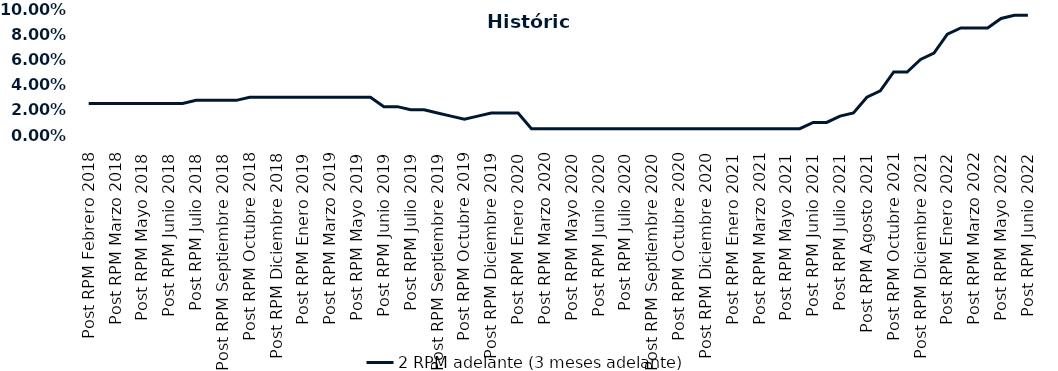
| Category | 2 RPM adelante (3 meses adelante) |
|---|---|
| Post RPM Febrero 2018 | 0.025 |
| Pre RPM Marzo 2018 | 0.025 |
| Post RPM Marzo 2018 | 0.025 |
| Pre RPM Mayo 2018 | 0.025 |
| Post RPM Mayo 2018 | 0.025 |
| Pre RPM Junio 2018 | 0.025 |
| Post RPM Junio 2018 | 0.025 |
| Pre RPM Julio 2018 | 0.025 |
| Post RPM Julio 2018 | 0.028 |
| Pre RPM Septiembre 2018 | 0.028 |
| Post RPM Septiembre 2018 | 0.028 |
| Pre RPM Octubre 2018 | 0.028 |
| Post RPM Octubre 2018 | 0.03 |
| Pre RPM Diciembre 2018 | 0.03 |
| Post RPM Diciembre 2018 | 0.03 |
| Pre RPM Enero 2019 | 0.03 |
| Post RPM Enero 2019 | 0.03 |
| Pre RPM Marzo 2019 | 0.03 |
| Post RPM Marzo 2019 | 0.03 |
| Pre RPM Mayo 2019 | 0.03 |
| Post RPM Mayo 2019 | 0.03 |
| Pre RPM Junio 2019 | 0.03 |
| Post RPM Junio 2019 | 0.022 |
| Pre RPM Julio 2019 | 0.022 |
| Post RPM Julio 2019 | 0.02 |
| Pre RPM Septiembre 2019 | 0.02 |
| Post RPM Septiembre 2019 | 0.018 |
| Pre RPM Octubre 2019 | 0.015 |
| Post RPM Octubre 2019 | 0.012 |
| Pre RPM Diciembre 2019 | 0.015 |
| Post RPM Diciembre 2019 | 0.018 |
| Pre RPM Enero 2020 | 0.018 |
| Post RPM Enero 2020 | 0.018 |
| Pre RPM Marzo 2020 | 0.005 |
| Post RPM Marzo 2020 | 0.005 |
| Pre RPM Mayo 2020 | 0.005 |
| Post RPM Mayo 2020 | 0.005 |
| Pre RPM Junio 2020 | 0.005 |
| Post RPM Junio 2020 | 0.005 |
| Pre RPM Julio 2020 | 0.005 |
| Post RPM Julio 2020 | 0.005 |
| Pre RPM Septiembre 2020 | 0.005 |
| Post RPM Septiembre 2020 | 0.005 |
| Pre RPM Octubre 2020 | 0.005 |
| Post RPM Octubre 2020 | 0.005 |
| Pre RPM Diciembre 2020 | 0.005 |
| Post RPM Diciembre 2020 | 0.005 |
| Pre RPM Enero 2021 | 0.005 |
| Post RPM Enero 2021 | 0.005 |
| Pre RPM Marzo 2021 | 0.005 |
| Post RPM Marzo 2021 | 0.005 |
| Pre RPM Mayo 2021 | 0.005 |
| Post RPM Mayo 2021 | 0.005 |
| Pre RPM Junio 2021 | 0.005 |
| Post RPM Junio 2021 | 0.01 |
| Pre RPM Julio 2021 | 0.01 |
| Post RPM Julio 2021 | 0.015 |
| Pre RPM Agosto 2021 | 0.018 |
| Post RPM Agosto 2021 | 0.03 |
| Pre RPM Octubre 2021 | 0.035 |
| Post RPM Octubre 2021 | 0.05 |
| Pre RPM Diciembre 2021 | 0.05 |
| Post RPM Diciembre 2021 | 0.06 |
| Pre RPM Enero 2022 | 0.065 |
| Post RPM Enero 2022 | 0.08 |
| Pre RPM Marzo 2022 | 0.085 |
| Post RPM Marzo 2022 | 0.085 |
| Pre RPM Mayo 2022 | 0.085 |
| Post RPM Mayo 2022 | 0.092 |
| Pre RPM Junio 2022 | 0.095 |
| Post RPM Junio 2022 | 0.095 |